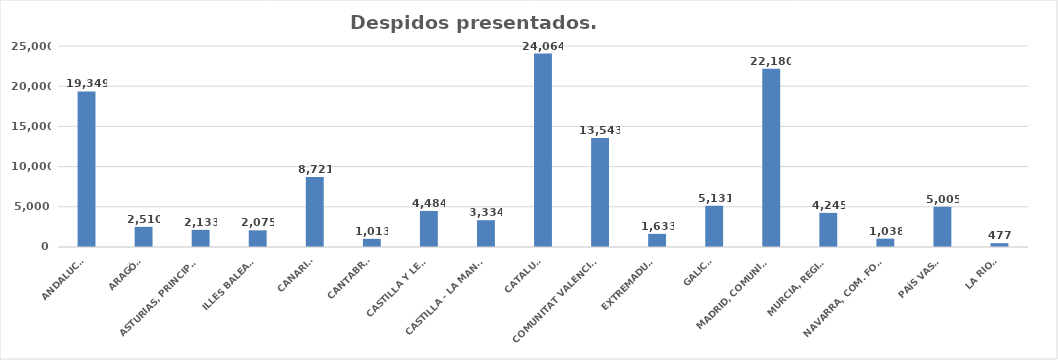
| Category | Series 0 |
|---|---|
| ANDALUCÍA | 19349 |
| ARAGÓN | 2510 |
| ASTURIAS, PRINCIPADO | 2133 |
| ILLES BALEARS | 2075 |
| CANARIAS | 8721 |
| CANTABRIA | 1013 |
| CASTILLA Y LEÓN | 4484 |
| CASTILLA - LA MANCHA | 3334 |
| CATALUÑA | 24064 |
| COMUNITAT VALENCIANA | 13543 |
| EXTREMADURA | 1633 |
| GALICIA | 5131 |
| MADRID, COMUNIDAD | 22180 |
| MURCIA, REGIÓN | 4245 |
| NAVARRA, COM. FORAL | 1038 |
| PAÍS VASCO | 5005 |
| LA RIOJA | 477 |